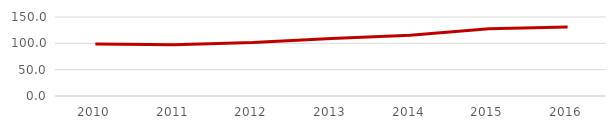
| Category | Proporción de la Deuda de las Partcipaciones Recibidas |
|---|---|
| 2010.0 | 98.83 |
| 2011.0 | 97.388 |
| 2012.0 | 101.604 |
| 2013.0 | 109.374 |
| 2014.0 | 115.405 |
| 2015.0 | 127.67 |
| 2016.0 | 131.112 |